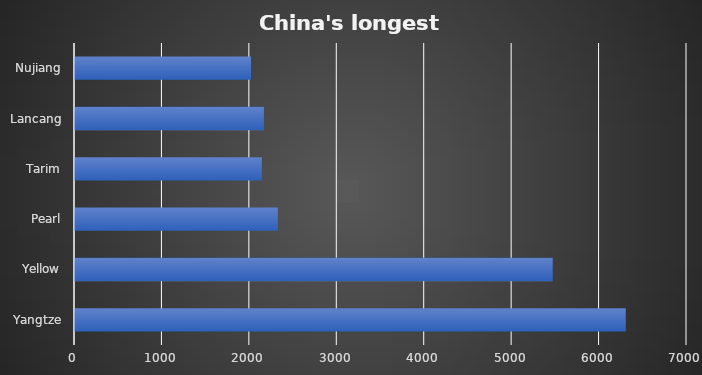
| Category | Series 0 |
|---|---|
| Yangtze | 6300 |
| Yellow | 5464 |
| Pearl | 2320 |
| Tarim | 2137 |
| Lancang | 2161 |
| Nujiang | 2013 |